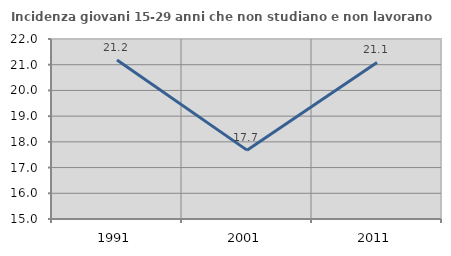
| Category | Incidenza giovani 15-29 anni che non studiano e non lavorano  |
|---|---|
| 1991.0 | 21.186 |
| 2001.0 | 17.678 |
| 2011.0 | 21.089 |